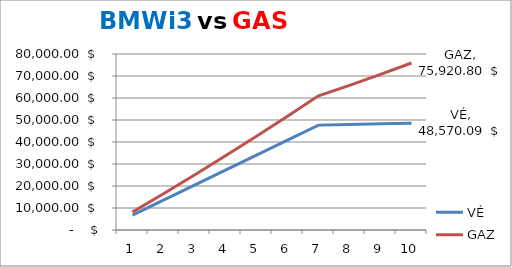
| Category | VÉ | GAZ |
|---|---|---|
| 0 | 6794.42 | 8168.44 |
| 1 | 13593.95 | 16504.88 |
| 2 | 20398.692 | 25017.72 |
| 3 | 27208.751 | 33715.78 |
| 4 | 34024.232 | 42608.321 |
| 5 | 40845.245 | 51705.067 |
| 6 | 47671.899 | 61016.228 |
| 7 | 47965.389 | 65744.086 |
| 8 | 48264.748 | 70708.336 |
| 9 | 48570.094 | 75920.799 |